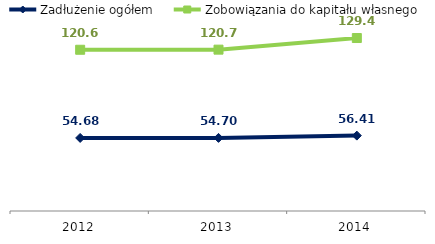
| Category | Zadłużenie ogółem | Zobowiązania do kapitału własnego |
|---|---|---|
| 2012.0 | 54.68 | 120.65 |
| 2013.0 | 54.7 | 120.74 |
| 2014.0 | 56.41 | 129.43 |